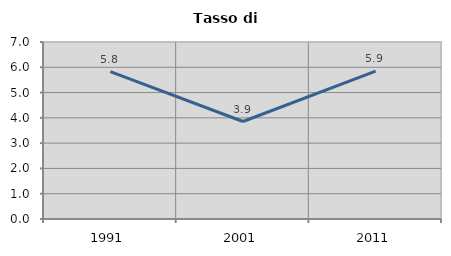
| Category | Tasso di disoccupazione   |
|---|---|
| 1991.0 | 5.826 |
| 2001.0 | 3.855 |
| 2011.0 | 5.851 |